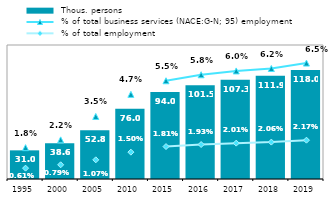
| Category |  Thous. persons |
|---|---|
| 1995.0 | 31 |
| 2000.0 | 38.619 |
| 2005.0 | 52.808 |
| 2010.0 | 76.014 |
| 2015.0 | 94.048 |
| 2016.0 | 101.515 |
| 2017.0 | 107.325 |
| 2018.0 | 111.859 |
| 2019.0 | 117.977 |